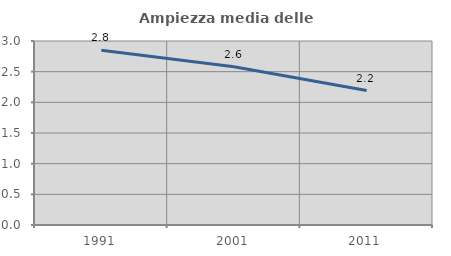
| Category | Ampiezza media delle famiglie |
|---|---|
| 1991.0 | 2.848 |
| 2001.0 | 2.581 |
| 2011.0 | 2.193 |